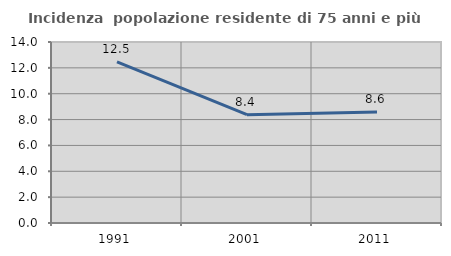
| Category | Incidenza  popolazione residente di 75 anni e più |
|---|---|
| 1991.0 | 12.456 |
| 2001.0 | 8.378 |
| 2011.0 | 8.589 |